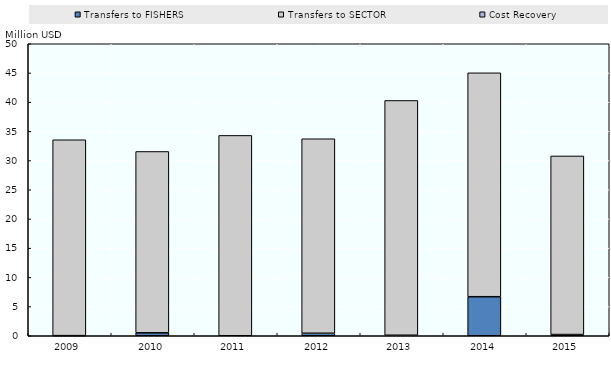
| Category | Transfers to FISHERS | Transfers to SECTOR | Cost Recovery |
|---|---|---|---|
| 2009.0 | 0.018 | 33.543 |  |
| 2010.0 | 0.504 | 31.054 |  |
| 2011.0 | 0 | 34.305 |  |
| 2012.0 | 0.427 | 33.306 |  |
| 2013.0 | 0.087 | 40.202 |  |
| 2014.0 | 6.684 | 38.341 |  |
| 2015.0 | 0.206 | 30.582 |  |